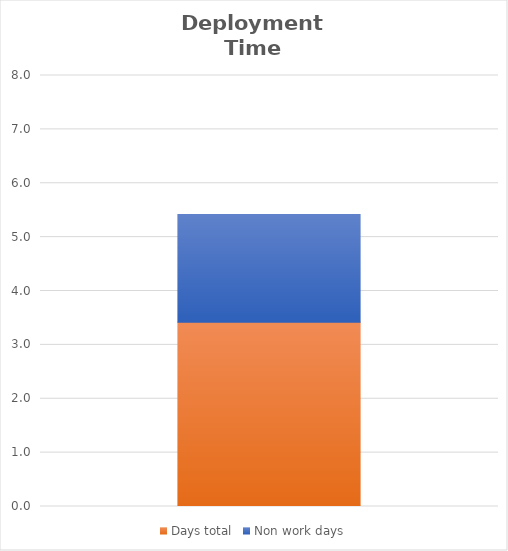
| Category | Days total | Non work days |
|---|---|---|
| 0 | 3.419 | 2 |